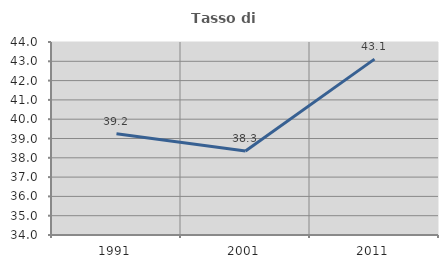
| Category | Tasso di occupazione   |
|---|---|
| 1991.0 | 39.241 |
| 2001.0 | 38.35 |
| 2011.0 | 43.112 |